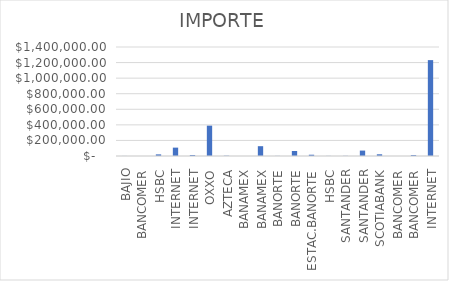
| Category | IMPORTE |
|---|---|
| BAJIO | 720.24 |
| BANCOMER | 280 |
| HSBC | 20829.4 |
| INTERNET | 107490.17 |
| INTERNET | 13200 |
| OXXO | 389739.48 |
| AZTECA | 3869.52 |
| BANAMEX | 287.2 |
| BANAMEX | 126001.2 |
| BANORTE | 1560.38 |
| BANORTE | 63978.69 |
| ESTAC.BANORTE | 16327 |
| HSBC | 1404.8 |
| SANTANDER | 2066.69 |
| SANTANDER | 69575.27 |
| SCOTIABANK | 21956.26 |
| BANCOMER | 218.77 |
| BANCOMER | 12231.99 |
| INTERNET | 1231487.67 |